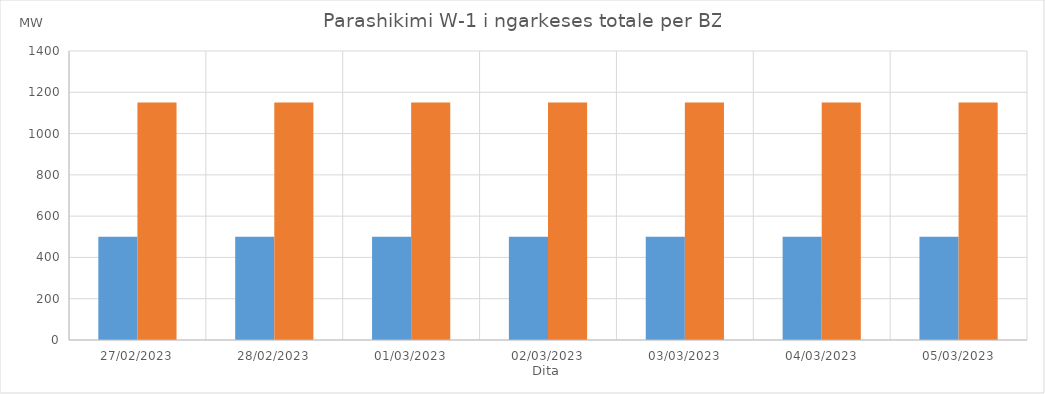
| Category | Min (MW) | Max (MW) |
|---|---|---|
| 27/02/2023 | 500 | 1150 |
| 28/02/2023 | 500 | 1150 |
| 01/03/2023 | 500 | 1150 |
| 02/03/2023 | 500 | 1150 |
| 03/03/2023 | 500 | 1150 |
| 04/03/2023 | 500 | 1150 |
| 05/03/2023 | 500 | 1150 |